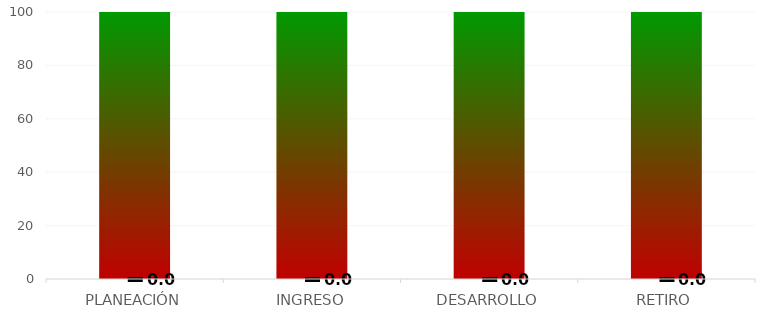
| Category | Rangos |
|---|---|
| PLANEACIÓN | 100 |
| INGRESO | 100 |
| DESARROLLO | 100 |
| RETIRO | 100 |